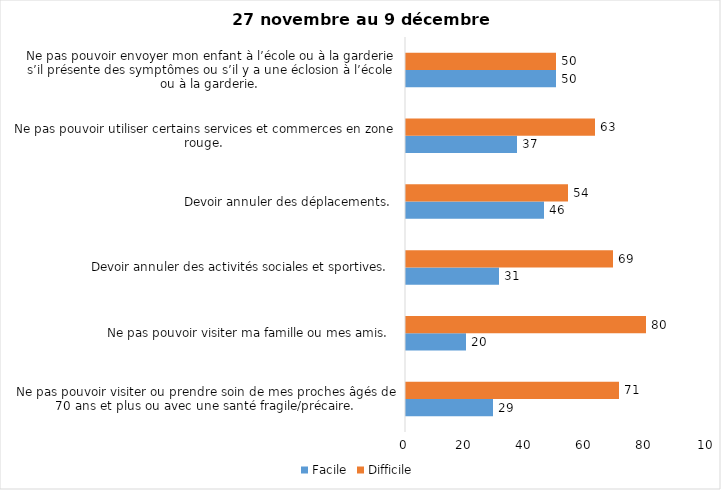
| Category | Facile | Difficile |
|---|---|---|
| Ne pas pouvoir visiter ou prendre soin de mes proches âgés de 70 ans et plus ou avec une santé fragile/précaire.  | 29 | 71 |
| Ne pas pouvoir visiter ma famille ou mes amis.  | 20 | 80 |
| Devoir annuler des activités sociales et sportives.  | 31 | 69 |
| Devoir annuler des déplacements.  | 46 | 54 |
| Ne pas pouvoir utiliser certains services et commerces en zone rouge.  | 37 | 63 |
| Ne pas pouvoir envoyer mon enfant à l’école ou à la garderie s’il présente des symptômes ou s’il y a une éclosion à l’école ou à la garderie.  | 50 | 50 |